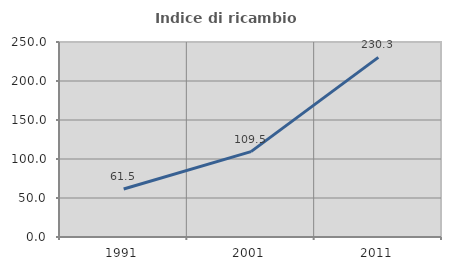
| Category | Indice di ricambio occupazionale  |
|---|---|
| 1991.0 | 61.538 |
| 2001.0 | 109.475 |
| 2011.0 | 230.303 |